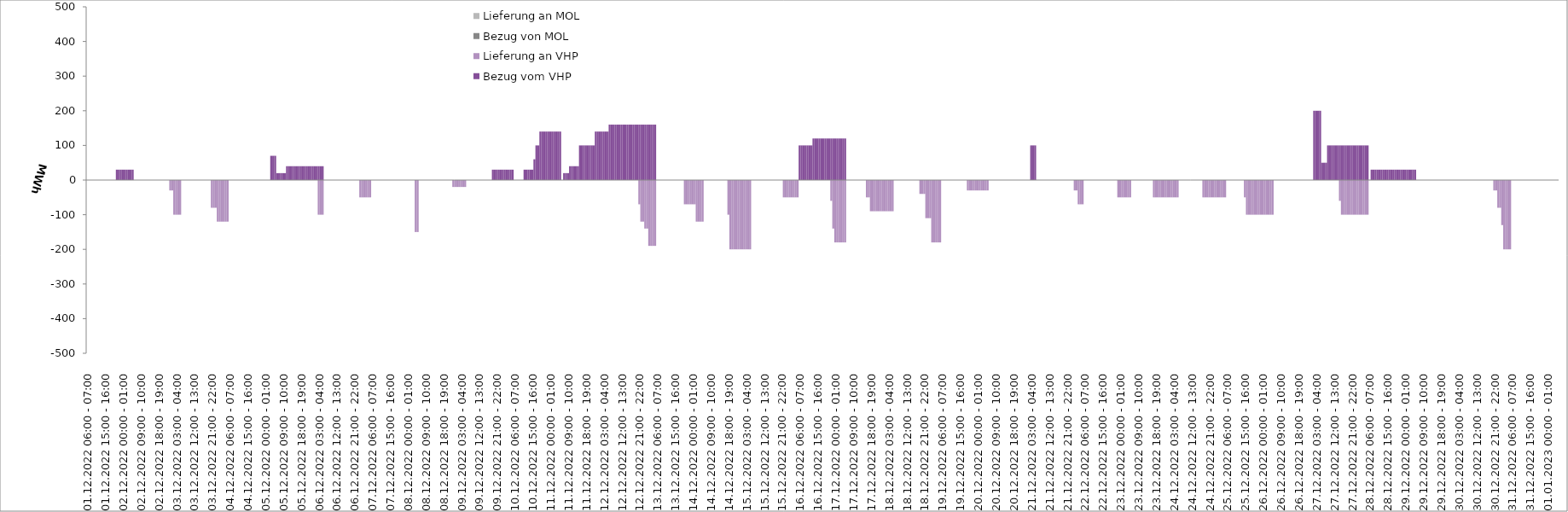
| Category | Bezug vom VHP | Lieferung an VHP | Bezug von MOL | Lieferung an MOL |
|---|---|---|---|---|
| 01.12.2022 06:00 - 07:00 | 0 | 0 | 0 | 0 |
| 01.12.2022 07:00 - 08:00 | 0 | 0 | 0 | 0 |
| 01.12.2022 08:00 - 09:00 | 0 | 0 | 0 | 0 |
| 01.12.2022 09:00 - 10:00 | 0 | 0 | 0 | 0 |
| 01.12.2022 10:00 - 11:00 | 0 | 0 | 0 | 0 |
| 01.12.2022 11:00 - 12:00 | 0 | 0 | 0 | 0 |
| 01.12.2022 12:00 - 13:00 | 0 | 0 | 0 | 0 |
| 01.12.2022 13:00 - 14:00 | 0 | 0 | 0 | 0 |
| 01.12.2022 14:00 - 15:00 | 0 | 0 | 0 | 0 |
| 01.12.2022 15:00 - 16:00 | 0 | 0 | 0 | 0 |
| 01.12.2022 16:00 - 17:00 | 0 | 0 | 0 | 0 |
| 01.12.2022 17:00 - 18:00 | 0 | 0 | 0 | 0 |
| 01.12.2022 18:00 - 19:00 | 0 | 0 | 0 | 0 |
| 01.12.2022 19:00 - 20:00 | 0 | 0 | 0 | 0 |
| 01.12.2022 20:00 - 21:00 | 0 | 0 | 0 | 0 |
| 01.12.2022 21:00 - 22:00 | 30 | 0 | 0 | 0 |
| 01.12.2022 22:00 - 23:00 | 30 | 0 | 0 | 0 |
| 01.12.2022 23:00 - 24:00 | 30 | 0 | 0 | 0 |
| 02.12.2022 00:00 - 01:00 | 30 | 0 | 0 | 0 |
| 02.12.2022 01:00 - 02:00 | 30 | 0 | 0 | 0 |
| 02.12.2022 02:00 - 03:00 | 30 | 0 | 0 | 0 |
| 02.12.2022 03:00 - 04:00 | 30 | 0 | 0 | 0 |
| 02.12.2022 04:00 - 05:00 | 30 | 0 | 0 | 0 |
| 02.12.2022 05:00 - 06:00 | 30 | 0 | 0 | 0 |
| 02.12.2022 06:00 - 07:00 | 0 | 0 | 0 | 0 |
| 02.12.2022 07:00 - 08:00 | 0 | 0 | 0 | 0 |
| 02.12.2022 08:00 - 09:00 | 0 | 0 | 0 | 0 |
| 02.12.2022 09:00 - 10:00 | 0 | 0 | 0 | 0 |
| 02.12.2022 10:00 - 11:00 | 0 | 0 | 0 | 0 |
| 02.12.2022 11:00 - 12:00 | 0 | 0 | 0 | 0 |
| 02.12.2022 12:00 - 13:00 | 0 | 0 | 0 | 0 |
| 02.12.2022 13:00 - 14:00 | 0 | 0 | 0 | 0 |
| 02.12.2022 14:00 - 15:00 | 0 | 0 | 0 | 0 |
| 02.12.2022 15:00 - 16:00 | 0 | 0 | 0 | 0 |
| 02.12.2022 16:00 - 17:00 | 0 | 0 | 0 | 0 |
| 02.12.2022 17:00 - 18:00 | 0 | 0 | 0 | 0 |
| 02.12.2022 18:00 - 19:00 | 0 | 0 | 0 | 0 |
| 02.12.2022 19:00 - 20:00 | 0 | 0 | 0 | 0 |
| 02.12.2022 20:00 - 21:00 | 0 | 0 | 0 | 0 |
| 02.12.2022 21:00 - 22:00 | 0 | 0 | 0 | 0 |
| 02.12.2022 22:00 - 23:00 | 0 | 0 | 0 | 0 |
| 02.12.2022 23:00 - 24:00 | 0 | 0 | 0 | 0 |
| 03.12.2022 00:00 - 01:00 | 0 | -30 | 0 | 0 |
| 03.12.2022 01:00 - 02:00 | 0 | -30 | 0 | 0 |
| 03.12.2022 02:00 - 03:00 | 0 | -100 | 0 | 0 |
| 03.12.2022 03:00 - 04:00 | 0 | -100 | 0 | 0 |
| 03.12.2022 04:00 - 05:00 | 0 | -100 | 0 | 0 |
| 03.12.2022 05:00 - 06:00 | 0 | -100 | 0 | 0 |
| 03.12.2022 06:00 - 07:00 | 0 | 0 | 0 | 0 |
| 03.12.2022 07:00 - 08:00 | 0 | 0 | 0 | 0 |
| 03.12.2022 08:00 - 09:00 | 0 | 0 | 0 | 0 |
| 03.12.2022 09:00 - 10:00 | 0 | 0 | 0 | 0 |
| 03.12.2022 10:00 - 11:00 | 0 | 0 | 0 | 0 |
| 03.12.2022 11:00 - 12:00 | 0 | 0 | 0 | 0 |
| 03.12.2022 12:00 - 13:00 | 0 | 0 | 0 | 0 |
| 03.12.2022 13:00 - 14:00 | 0 | 0 | 0 | 0 |
| 03.12.2022 14:00 - 15:00 | 0 | 0 | 0 | 0 |
| 03.12.2022 15:00 - 16:00 | 0 | 0 | 0 | 0 |
| 03.12.2022 16:00 - 17:00 | 0 | 0 | 0 | 0 |
| 03.12.2022 17:00 - 18:00 | 0 | 0 | 0 | 0 |
| 03.12.2022 18:00 - 19:00 | 0 | 0 | 0 | 0 |
| 03.12.2022 19:00 - 20:00 | 0 | 0 | 0 | 0 |
| 03.12.2022 20:00 - 21:00 | 0 | 0 | 0 | 0 |
| 03.12.2022 21:00 - 22:00 | 0 | -80 | 0 | 0 |
| 03.12.2022 22:00 - 23:00 | 0 | -80 | 0 | 0 |
| 03.12.2022 23:00 - 24:00 | 0 | -80 | 0 | 0 |
| 04.12.2022 00:00 - 01:00 | 0 | -120 | 0 | 0 |
| 04.12.2022 01:00 - 02:00 | 0 | -120 | 0 | 0 |
| 04.12.2022 02:00 - 03:00 | 0 | -120 | 0 | 0 |
| 04.12.2022 03:00 - 04:00 | 0 | -120 | 0 | 0 |
| 04.12.2022 04:00 - 05:00 | 0 | -120 | 0 | 0 |
| 04.12.2022 05:00 - 06:00 | 0 | -120 | 0 | 0 |
| 04.12.2022 06:00 - 07:00 | 0 | 0 | 0 | 0 |
| 04.12.2022 07:00 - 08:00 | 0 | 0 | 0 | 0 |
| 04.12.2022 08:00 - 09:00 | 0 | 0 | 0 | 0 |
| 04.12.2022 09:00 - 10:00 | 0 | 0 | 0 | 0 |
| 04.12.2022 10:00 - 11:00 | 0 | 0 | 0 | 0 |
| 04.12.2022 11:00 - 12:00 | 0 | 0 | 0 | 0 |
| 04.12.2022 12:00 - 13:00 | 0 | 0 | 0 | 0 |
| 04.12.2022 13:00 - 14:00 | 0 | 0 | 0 | 0 |
| 04.12.2022 14:00 - 15:00 | 0 | 0 | 0 | 0 |
| 04.12.2022 15:00 - 16:00 | 0 | 0 | 0 | 0 |
| 04.12.2022 16:00 - 17:00 | 0 | 0 | 0 | 0 |
| 04.12.2022 17:00 - 18:00 | 0 | 0 | 0 | 0 |
| 04.12.2022 18:00 - 19:00 | 0 | 0 | 0 | 0 |
| 04.12.2022 19:00 - 20:00 | 0 | 0 | 0 | 0 |
| 04.12.2022 20:00 - 21:00 | 0 | 0 | 0 | 0 |
| 04.12.2022 21:00 - 22:00 | 0 | 0 | 0 | 0 |
| 04.12.2022 22:00 - 23:00 | 0 | 0 | 0 | 0 |
| 04.12.2022 23:00 - 24:00 | 0 | 0 | 0 | 0 |
| 05.12.2022 00:00 - 01:00 | 0 | 0 | 0 | 0 |
| 05.12.2022 01:00 - 02:00 | 0 | 0 | 0 | 0 |
| 05.12.2022 02:00 - 03:00 | 0 | 0 | 0 | 0 |
| 05.12.2022 03:00 - 04:00 | 70 | 0 | 0 | 0 |
| 05.12.2022 04:00 - 05:00 | 70 | 0 | 0 | 0 |
| 05.12.2022 05:00 - 06:00 | 70 | 0 | 0 | 0 |
| 05.12.2022 06:00 - 07:00 | 20 | 0 | 0 | 0 |
| 05.12.2022 07:00 - 08:00 | 20 | 0 | 0 | 0 |
| 05.12.2022 08:00 - 09:00 | 20 | 0 | 0 | 0 |
| 05.12.2022 09:00 - 10:00 | 20 | 0 | 0 | 0 |
| 05.12.2022 10:00 - 11:00 | 20 | 0 | 0 | 0 |
| 05.12.2022 11:00 - 12:00 | 40 | 0 | 0 | 0 |
| 05.12.2022 12:00 - 13:00 | 40 | 0 | 0 | 0 |
| 05.12.2022 13:00 - 14:00 | 40 | 0 | 0 | 0 |
| 05.12.2022 14:00 - 15:00 | 40 | 0 | 0 | 0 |
| 05.12.2022 15:00 - 16:00 | 40 | 0 | 0 | 0 |
| 05.12.2022 16:00 - 17:00 | 40 | 0 | 0 | 0 |
| 05.12.2022 17:00 - 18:00 | 40 | 0 | 0 | 0 |
| 05.12.2022 18:00 - 19:00 | 40 | 0 | 0 | 0 |
| 05.12.2022 19:00 - 20:00 | 40 | 0 | 0 | 0 |
| 05.12.2022 20:00 - 21:00 | 40 | 0 | 0 | 0 |
| 05.12.2022 21:00 - 22:00 | 40 | 0 | 0 | 0 |
| 05.12.2022 22:00 - 23:00 | 40 | 0 | 0 | 0 |
| 05.12.2022 23:00 - 24:00 | 40 | 0 | 0 | 0 |
| 06.12.2022 00:00 - 01:00 | 40 | 0 | 0 | 0 |
| 06.12.2022 01:00 - 02:00 | 40 | 0 | 0 | 0 |
| 06.12.2022 02:00 - 03:00 | 40 | 0 | 0 | 0 |
| 06.12.2022 03:00 - 04:00 | 40 | -100 | 0 | 0 |
| 06.12.2022 04:00 - 05:00 | 40 | -100 | 0 | 0 |
| 06.12.2022 05:00 - 06:00 | 40 | -100 | 0 | 0 |
| 06.12.2022 06:00 - 07:00 | 0 | 0 | 0 | 0 |
| 06.12.2022 07:00 - 08:00 | 0 | 0 | 0 | 0 |
| 06.12.2022 08:00 - 09:00 | 0 | 0 | 0 | 0 |
| 06.12.2022 09:00 - 10:00 | 0 | 0 | 0 | 0 |
| 06.12.2022 10:00 - 11:00 | 0 | 0 | 0 | 0 |
| 06.12.2022 11:00 - 12:00 | 0 | 0 | 0 | 0 |
| 06.12.2022 12:00 - 13:00 | 0 | 0 | 0 | 0 |
| 06.12.2022 13:00 - 14:00 | 0 | 0 | 0 | 0 |
| 06.12.2022 14:00 - 15:00 | 0 | 0 | 0 | 0 |
| 06.12.2022 15:00 - 16:00 | 0 | 0 | 0 | 0 |
| 06.12.2022 16:00 - 17:00 | 0 | 0 | 0 | 0 |
| 06.12.2022 17:00 - 18:00 | 0 | 0 | 0 | 0 |
| 06.12.2022 18:00 - 19:00 | 0 | 0 | 0 | 0 |
| 06.12.2022 19:00 - 20:00 | 0 | 0 | 0 | 0 |
| 06.12.2022 20:00 - 21:00 | 0 | 0 | 0 | 0 |
| 06.12.2022 21:00 - 22:00 | 0 | 0 | 0 | 0 |
| 06.12.2022 22:00 - 23:00 | 0 | 0 | 0 | 0 |
| 06.12.2022 23:00 - 24:00 | 0 | 0 | 0 | 0 |
| 07.12.2022 00:00 - 01:00 | 0 | -50 | 0 | 0 |
| 07.12.2022 01:00 - 02:00 | 0 | -50 | 0 | 0 |
| 07.12.2022 02:00 - 03:00 | 0 | -50 | 0 | 0 |
| 07.12.2022 03:00 - 04:00 | 0 | -50 | 0 | 0 |
| 07.12.2022 04:00 - 05:00 | 0 | -50 | 0 | 0 |
| 07.12.2022 05:00 - 06:00 | 0 | -50 | 0 | 0 |
| 07.12.2022 06:00 - 07:00 | 0 | 0 | 0 | 0 |
| 07.12.2022 07:00 - 08:00 | 0 | 0 | 0 | 0 |
| 07.12.2022 08:00 - 09:00 | 0 | 0 | 0 | 0 |
| 07.12.2022 09:00 - 10:00 | 0 | 0 | 0 | 0 |
| 07.12.2022 10:00 - 11:00 | 0 | 0 | 0 | 0 |
| 07.12.2022 11:00 - 12:00 | 0 | 0 | 0 | 0 |
| 07.12.2022 12:00 - 13:00 | 0 | 0 | 0 | 0 |
| 07.12.2022 13:00 - 14:00 | 0 | 0 | 0 | 0 |
| 07.12.2022 14:00 - 15:00 | 0 | 0 | 0 | 0 |
| 07.12.2022 15:00 - 16:00 | 0 | 0 | 0 | 0 |
| 07.12.2022 16:00 - 17:00 | 0 | 0 | 0 | 0 |
| 07.12.2022 17:00 - 18:00 | 0 | 0 | 0 | 0 |
| 07.12.2022 18:00 - 19:00 | 0 | 0 | 0 | 0 |
| 07.12.2022 19:00 - 20:00 | 0 | 0 | 0 | 0 |
| 07.12.2022 20:00 - 21:00 | 0 | 0 | 0 | 0 |
| 07.12.2022 21:00 - 22:00 | 0 | 0 | 0 | 0 |
| 07.12.2022 22:00 - 23:00 | 0 | 0 | 0 | 0 |
| 07.12.2022 23:00 - 24:00 | 0 | 0 | 0 | 0 |
| 08.12.2022 00:00 - 01:00 | 0 | 0 | 0 | 0 |
| 08.12.2022 01:00 - 02:00 | 0 | 0 | 0 | 0 |
| 08.12.2022 02:00 - 03:00 | 0 | 0 | 0 | 0 |
| 08.12.2022 03:00 - 04:00 | 0 | 0 | 0 | 0 |
| 08.12.2022 04:00 - 05:00 | 0 | -150 | 0 | 0 |
| 08.12.2022 05:00 - 06:00 | 0 | -150 | 0 | 0 |
| 08.12.2022 06:00 - 07:00 | 0 | 0 | 0 | 0 |
| 08.12.2022 07:00 - 08:00 | 0 | 0 | 0 | 0 |
| 08.12.2022 08:00 - 09:00 | 0 | 0 | 0 | 0 |
| 08.12.2022 09:00 - 10:00 | 0 | 0 | 0 | 0 |
| 08.12.2022 10:00 - 11:00 | 0 | 0 | 0 | 0 |
| 08.12.2022 11:00 - 12:00 | 0 | 0 | 0 | 0 |
| 08.12.2022 12:00 - 13:00 | 0 | 0 | 0 | 0 |
| 08.12.2022 13:00 - 14:00 | 0 | 0 | 0 | 0 |
| 08.12.2022 14:00 - 15:00 | 0 | 0 | 0 | 0 |
| 08.12.2022 15:00 - 16:00 | 0 | 0 | 0 | 0 |
| 08.12.2022 16:00 - 17:00 | 0 | 0 | 0 | 0 |
| 08.12.2022 17:00 - 18:00 | 0 | 0 | 0 | 0 |
| 08.12.2022 18:00 - 19:00 | 0 | 0 | 0 | 0 |
| 08.12.2022 19:00 - 20:00 | 0 | 0 | 0 | 0 |
| 08.12.2022 20:00 - 21:00 | 0 | 0 | 0 | 0 |
| 08.12.2022 21:00 - 22:00 | 0 | 0 | 0 | 0 |
| 08.12.2022 22:00 - 23:00 | 0 | 0 | 0 | 0 |
| 08.12.2022 23:00 - 24:00 | 0 | -20 | 0 | 0 |
| 09.12.2022 00:00 - 01:00 | 0 | -20 | 0 | 0 |
| 09.12.2022 01:00 - 02:00 | 0 | -20 | 0 | 0 |
| 09.12.2022 02:00 - 03:00 | 0 | -20 | 0 | 0 |
| 09.12.2022 03:00 - 04:00 | 0 | -20 | 0 | 0 |
| 09.12.2022 04:00 - 05:00 | 0 | -20 | 0 | 0 |
| 09.12.2022 05:00 - 06:00 | 0 | -20 | 0 | 0 |
| 09.12.2022 06:00 - 07:00 | 0 | 0 | 0 | 0 |
| 09.12.2022 07:00 - 08:00 | 0 | 0 | 0 | 0 |
| 09.12.2022 08:00 - 09:00 | 0 | 0 | 0 | 0 |
| 09.12.2022 09:00 - 10:00 | 0 | 0 | 0 | 0 |
| 09.12.2022 10:00 - 11:00 | 0 | 0 | 0 | 0 |
| 09.12.2022 11:00 - 12:00 | 0 | 0 | 0 | 0 |
| 09.12.2022 12:00 - 13:00 | 0 | 0 | 0 | 0 |
| 09.12.2022 13:00 - 14:00 | 0 | 0 | 0 | 0 |
| 09.12.2022 14:00 - 15:00 | 0 | 0 | 0 | 0 |
| 09.12.2022 15:00 - 16:00 | 0 | 0 | 0 | 0 |
| 09.12.2022 16:00 - 17:00 | 0 | 0 | 0 | 0 |
| 09.12.2022 17:00 - 18:00 | 0 | 0 | 0 | 0 |
| 09.12.2022 18:00 - 19:00 | 0 | 0 | 0 | 0 |
| 09.12.2022 19:00 - 20:00 | 30 | 0 | 0 | 0 |
| 09.12.2022 20:00 - 21:00 | 30 | 0 | 0 | 0 |
| 09.12.2022 21:00 - 22:00 | 30 | 0 | 0 | 0 |
| 09.12.2022 22:00 - 23:00 | 30 | 0 | 0 | 0 |
| 09.12.2022 23:00 - 24:00 | 30 | 0 | 0 | 0 |
| 10.12.2022 00:00 - 01:00 | 30 | 0 | 0 | 0 |
| 10.12.2022 01:00 - 02:00 | 30 | 0 | 0 | 0 |
| 10.12.2022 02:00 - 03:00 | 30 | 0 | 0 | 0 |
| 10.12.2022 03:00 - 04:00 | 30 | 0 | 0 | 0 |
| 10.12.2022 04:00 - 05:00 | 30 | 0 | 0 | 0 |
| 10.12.2022 05:00 - 06:00 | 30 | 0 | 0 | 0 |
| 10.12.2022 06:00 - 07:00 | 0 | 0 | 0 | 0 |
| 10.12.2022 07:00 - 08:00 | 0 | 0 | 0 | 0 |
| 10.12.2022 08:00 - 09:00 | 0 | 0 | 0 | 0 |
| 10.12.2022 09:00 - 10:00 | 0 | 0 | 0 | 0 |
| 10.12.2022 10:00 - 11:00 | 0 | 0 | 0 | 0 |
| 10.12.2022 11:00 - 12:00 | 30 | 0 | 0 | 0 |
| 10.12.2022 12:00 - 13:00 | 30 | 0 | 0 | 0 |
| 10.12.2022 13:00 - 14:00 | 30 | 0 | 0 | 0 |
| 10.12.2022 14:00 - 15:00 | 30 | 0 | 0 | 0 |
| 10.12.2022 15:00 - 16:00 | 30 | 0 | 0 | 0 |
| 10.12.2022 16:00 - 17:00 | 60 | 0 | 0 | 0 |
| 10.12.2022 17:00 - 18:00 | 100 | 0 | 0 | 0 |
| 10.12.2022 18:00 - 19:00 | 100 | 0 | 0 | 0 |
| 10.12.2022 19:00 - 20:00 | 140 | 0 | 0 | 0 |
| 10.12.2022 20:00 - 21:00 | 140 | 0 | 0 | 0 |
| 10.12.2022 21:00 - 22:00 | 140 | 0 | 0 | 0 |
| 10.12.2022 22:00 - 23:00 | 140 | 0 | 0 | 0 |
| 10.12.2022 23:00 - 24:00 | 140 | 0 | 0 | 0 |
| 11.12.2022 00:00 - 01:00 | 140 | 0 | 0 | 0 |
| 11.12.2022 01:00 - 02:00 | 140 | 0 | 0 | 0 |
| 11.12.2022 02:00 - 03:00 | 140 | 0 | 0 | 0 |
| 11.12.2022 03:00 - 04:00 | 140 | 0 | 0 | 0 |
| 11.12.2022 04:00 - 05:00 | 140 | 0 | 0 | 0 |
| 11.12.2022 05:00 - 06:00 | 140 | 0 | 0 | 0 |
| 11.12.2022 06:00 - 07:00 | 0 | 0 | 0 | 0 |
| 11.12.2022 07:00 - 08:00 | 20 | 0 | 0 | 0 |
| 11.12.2022 08:00 - 09:00 | 20 | 0 | 0 | 0 |
| 11.12.2022 09:00 - 10:00 | 20 | 0 | 0 | 0 |
| 11.12.2022 10:00 - 11:00 | 40 | 0 | 0 | 0 |
| 11.12.2022 11:00 - 12:00 | 40 | 0 | 0 | 0 |
| 11.12.2022 12:00 - 13:00 | 40 | 0 | 0 | 0 |
| 11.12.2022 13:00 - 14:00 | 40 | 0 | 0 | 0 |
| 11.12.2022 14:00 - 15:00 | 40 | 0 | 0 | 0 |
| 11.12.2022 15:00 - 16:00 | 100 | 0 | 0 | 0 |
| 11.12.2022 16:00 - 17:00 | 100 | 0 | 0 | 0 |
| 11.12.2022 17:00 - 18:00 | 100 | 0 | 0 | 0 |
| 11.12.2022 18:00 - 19:00 | 100 | 0 | 0 | 0 |
| 11.12.2022 19:00 - 20:00 | 100 | 0 | 0 | 0 |
| 11.12.2022 20:00 - 21:00 | 100 | 0 | 0 | 0 |
| 11.12.2022 21:00 - 22:00 | 100 | 0 | 0 | 0 |
| 11.12.2022 22:00 - 23:00 | 100 | 0 | 0 | 0 |
| 11.12.2022 23:00 - 24:00 | 140 | 0 | 0 | 0 |
| 12.12.2022 00:00 - 01:00 | 140 | 0 | 0 | 0 |
| 12.12.2022 01:00 - 02:00 | 140 | 0 | 0 | 0 |
| 12.12.2022 02:00 - 03:00 | 140 | 0 | 0 | 0 |
| 12.12.2022 03:00 - 04:00 | 140 | 0 | 0 | 0 |
| 12.12.2022 04:00 - 05:00 | 140 | 0 | 0 | 0 |
| 12.12.2022 05:00 - 06:00 | 140 | 0 | 0 | 0 |
| 12.12.2022 06:00 - 07:00 | 160 | 0 | 0 | 0 |
| 12.12.2022 07:00 - 08:00 | 160 | 0 | 0 | 0 |
| 12.12.2022 08:00 - 09:00 | 160 | 0 | 0 | 0 |
| 12.12.2022 09:00 - 10:00 | 160 | 0 | 0 | 0 |
| 12.12.2022 10:00 - 11:00 | 160 | 0 | 0 | 0 |
| 12.12.2022 11:00 - 12:00 | 160 | 0 | 0 | 0 |
| 12.12.2022 12:00 - 13:00 | 160 | 0 | 0 | 0 |
| 12.12.2022 13:00 - 14:00 | 160 | 0 | 0 | 0 |
| 12.12.2022 14:00 - 15:00 | 160 | 0 | 0 | 0 |
| 12.12.2022 15:00 - 16:00 | 160 | 0 | 0 | 0 |
| 12.12.2022 16:00 - 17:00 | 160 | 0 | 0 | 0 |
| 12.12.2022 17:00 - 18:00 | 160 | 0 | 0 | 0 |
| 12.12.2022 18:00 - 19:00 | 160 | 0 | 0 | 0 |
| 12.12.2022 19:00 - 20:00 | 160 | 0 | 0 | 0 |
| 12.12.2022 20:00 - 21:00 | 160 | 0 | 0 | 0 |
| 12.12.2022 21:00 - 22:00 | 160 | -70 | 0 | 0 |
| 12.12.2022 22:00 - 23:00 | 160 | -120 | 0 | 0 |
| 12.12.2022 23:00 - 24:00 | 160 | -120 | 0 | 0 |
| 13.12.2022 00:00 - 01:00 | 160 | -140 | 0 | 0 |
| 13.12.2022 01:00 - 02:00 | 160 | -140 | 0 | 0 |
| 13.12.2022 02:00 - 03:00 | 160 | -190 | 0 | 0 |
| 13.12.2022 03:00 - 04:00 | 160 | -190 | 0 | 0 |
| 13.12.2022 04:00 - 05:00 | 160 | -190 | 0 | 0 |
| 13.12.2022 05:00 - 06:00 | 160 | -190 | 0 | 0 |
| 13.12.2022 06:00 - 07:00 | 0 | 0 | 0 | 0 |
| 13.12.2022 07:00 - 08:00 | 0 | 0 | 0 | 0 |
| 13.12.2022 08:00 - 09:00 | 0 | 0 | 0 | 0 |
| 13.12.2022 09:00 - 10:00 | 0 | 0 | 0 | 0 |
| 13.12.2022 10:00 - 11:00 | 0 | 0 | 0 | 0 |
| 13.12.2022 11:00 - 12:00 | 0 | 0 | 0 | 0 |
| 13.12.2022 12:00 - 13:00 | 0 | 0 | 0 | 0 |
| 13.12.2022 13:00 - 14:00 | 0 | 0 | 0 | 0 |
| 13.12.2022 14:00 - 15:00 | 0 | 0 | 0 | 0 |
| 13.12.2022 15:00 - 16:00 | 0 | 0 | 0 | 0 |
| 13.12.2022 16:00 - 17:00 | 0 | 0 | 0 | 0 |
| 13.12.2022 17:00 - 18:00 | 0 | 0 | 0 | 0 |
| 13.12.2022 18:00 - 19:00 | 0 | 0 | 0 | 0 |
| 13.12.2022 19:00 - 20:00 | 0 | 0 | 0 | 0 |
| 13.12.2022 20:00 - 21:00 | 0 | -70 | 0 | 0 |
| 13.12.2022 21:00 - 22:00 | 0 | -70 | 0 | 0 |
| 13.12.2022 22:00 - 23:00 | 0 | -70 | 0 | 0 |
| 13.12.2022 23:00 - 24:00 | 0 | -70 | 0 | 0 |
| 14.12.2022 00:00 - 01:00 | 0 | -70 | 0 | 0 |
| 14.12.2022 01:00 - 02:00 | 0 | -70 | 0 | 0 |
| 14.12.2022 02:00 - 03:00 | 0 | -120 | 0 | 0 |
| 14.12.2022 03:00 - 04:00 | 0 | -120 | 0 | 0 |
| 14.12.2022 04:00 - 05:00 | 0 | -120 | 0 | 0 |
| 14.12.2022 05:00 - 06:00 | 0 | -120 | 0 | 0 |
| 14.12.2022 06:00 - 07:00 | 0 | 0 | 0 | 0 |
| 14.12.2022 07:00 - 08:00 | 0 | 0 | 0 | 0 |
| 14.12.2022 08:00 - 09:00 | 0 | 0 | 0 | 0 |
| 14.12.2022 09:00 - 10:00 | 0 | 0 | 0 | 0 |
| 14.12.2022 10:00 - 11:00 | 0 | 0 | 0 | 0 |
| 14.12.2022 11:00 - 12:00 | 0 | 0 | 0 | 0 |
| 14.12.2022 12:00 - 13:00 | 0 | 0 | 0 | 0 |
| 14.12.2022 13:00 - 14:00 | 0 | 0 | 0 | 0 |
| 14.12.2022 14:00 - 15:00 | 0 | 0 | 0 | 0 |
| 14.12.2022 15:00 - 16:00 | 0 | 0 | 0 | 0 |
| 14.12.2022 16:00 - 17:00 | 0 | 0 | 0 | 0 |
| 14.12.2022 17:00 - 18:00 | 0 | 0 | 0 | 0 |
| 14.12.2022 18:00 - 19:00 | 0 | -100 | 0 | 0 |
| 14.12.2022 19:00 - 20:00 | 0 | -200 | 0 | 0 |
| 14.12.2022 20:00 - 21:00 | 0 | -200 | 0 | 0 |
| 14.12.2022 21:00 - 22:00 | 0 | -200 | 0 | 0 |
| 14.12.2022 22:00 - 23:00 | 0 | -200 | 0 | 0 |
| 14.12.2022 23:00 - 24:00 | 0 | -200 | 0 | 0 |
| 15.12.2022 00:00 - 01:00 | 0 | -200 | 0 | 0 |
| 15.12.2022 01:00 - 02:00 | 0 | -200 | 0 | 0 |
| 15.12.2022 02:00 - 03:00 | 0 | -200 | 0 | 0 |
| 15.12.2022 03:00 - 04:00 | 0 | -200 | 0 | 0 |
| 15.12.2022 04:00 - 05:00 | 0 | -200 | 0 | 0 |
| 15.12.2022 05:00 - 06:00 | 0 | -200 | 0 | 0 |
| 15.12.2022 06:00 - 07:00 | 0 | 0 | 0 | 0 |
| 15.12.2022 07:00 - 08:00 | 0 | 0 | 0 | 0 |
| 15.12.2022 08:00 - 09:00 | 0 | 0 | 0 | 0 |
| 15.12.2022 09:00 - 10:00 | 0 | 0 | 0 | 0 |
| 15.12.2022 10:00 - 11:00 | 0 | 0 | 0 | 0 |
| 15.12.2022 11:00 - 12:00 | 0 | 0 | 0 | 0 |
| 15.12.2022 12:00 - 13:00 | 0 | 0 | 0 | 0 |
| 15.12.2022 13:00 - 14:00 | 0 | 0 | 0 | 0 |
| 15.12.2022 14:00 - 15:00 | 0 | 0 | 0 | 0 |
| 15.12.2022 15:00 - 16:00 | 0 | 0 | 0 | 0 |
| 15.12.2022 16:00 - 17:00 | 0 | 0 | 0 | 0 |
| 15.12.2022 17:00 - 18:00 | 0 | 0 | 0 | 0 |
| 15.12.2022 18:00 - 19:00 | 0 | 0 | 0 | 0 |
| 15.12.2022 19:00 - 20:00 | 0 | 0 | 0 | 0 |
| 15.12.2022 20:00 - 21:00 | 0 | 0 | 0 | 0 |
| 15.12.2022 21:00 - 22:00 | 0 | 0 | 0 | 0 |
| 15.12.2022 22:00 - 23:00 | 0 | -50 | 0 | 0 |
| 15.12.2022 23:00 - 24:00 | 0 | -50 | 0 | 0 |
| 16.12.2022 00:00 - 01:00 | 0 | -50 | 0 | 0 |
| 16.12.2022 01:00 - 02:00 | 0 | -50 | 0 | 0 |
| 16.12.2022 02:00 - 03:00 | 0 | -50 | 0 | 0 |
| 16.12.2022 03:00 - 04:00 | 0 | -50 | 0 | 0 |
| 16.12.2022 04:00 - 05:00 | 0 | -50 | 0 | 0 |
| 16.12.2022 05:00 - 06:00 | 0 | -50 | 0 | 0 |
| 16.12.2022 06:00 - 07:00 | 100 | 0 | 0 | 0 |
| 16.12.2022 07:00 - 08:00 | 100 | 0 | 0 | 0 |
| 16.12.2022 08:00 - 09:00 | 100 | 0 | 0 | 0 |
| 16.12.2022 09:00 - 10:00 | 100 | 0 | 0 | 0 |
| 16.12.2022 10:00 - 11:00 | 100 | 0 | 0 | 0 |
| 16.12.2022 11:00 - 12:00 | 100 | 0 | 0 | 0 |
| 16.12.2022 12:00 - 13:00 | 100 | 0 | 0 | 0 |
| 16.12.2022 13:00 - 14:00 | 120 | 0 | 0 | 0 |
| 16.12.2022 14:00 - 15:00 | 120 | 0 | 0 | 0 |
| 16.12.2022 15:00 - 16:00 | 120 | 0 | 0 | 0 |
| 16.12.2022 16:00 - 17:00 | 120 | 0 | 0 | 0 |
| 16.12.2022 17:00 - 18:00 | 120 | 0 | 0 | 0 |
| 16.12.2022 18:00 - 19:00 | 120 | 0 | 0 | 0 |
| 16.12.2022 19:00 - 20:00 | 120 | 0 | 0 | 0 |
| 16.12.2022 20:00 - 21:00 | 120 | 0 | 0 | 0 |
| 16.12.2022 21:00 - 22:00 | 120 | 0 | 0 | 0 |
| 16.12.2022 22:00 - 23:00 | 120 | -60 | 0 | 0 |
| 16.12.2022 23:00 - 24:00 | 120 | -140 | 0 | 0 |
| 17.12.2022 00:00 - 01:00 | 120 | -180 | 0 | 0 |
| 17.12.2022 01:00 - 02:00 | 120 | -180 | 0 | 0 |
| 17.12.2022 02:00 - 03:00 | 120 | -180 | 0 | 0 |
| 17.12.2022 03:00 - 04:00 | 120 | -180 | 0 | 0 |
| 17.12.2022 04:00 - 05:00 | 120 | -180 | 0 | 0 |
| 17.12.2022 05:00 - 06:00 | 120 | -180 | 0 | 0 |
| 17.12.2022 06:00 - 07:00 | 0 | 0 | 0 | 0 |
| 17.12.2022 07:00 - 08:00 | 0 | 0 | 0 | 0 |
| 17.12.2022 08:00 - 09:00 | 0 | 0 | 0 | 0 |
| 17.12.2022 09:00 - 10:00 | 0 | 0 | 0 | 0 |
| 17.12.2022 10:00 - 11:00 | 0 | 0 | 0 | 0 |
| 17.12.2022 11:00 - 12:00 | 0 | 0 | 0 | 0 |
| 17.12.2022 12:00 - 13:00 | 0 | 0 | 0 | 0 |
| 17.12.2022 13:00 - 14:00 | 0 | 0 | 0 | 0 |
| 17.12.2022 14:00 - 15:00 | 0 | 0 | 0 | 0 |
| 17.12.2022 15:00 - 16:00 | 0 | 0 | 0 | 0 |
| 17.12.2022 16:00 - 17:00 | 0 | -50 | 0 | 0 |
| 17.12.2022 17:00 - 18:00 | 0 | -50 | 0 | 0 |
| 17.12.2022 18:00 - 19:00 | 0 | -90 | 0 | 0 |
| 17.12.2022 19:00 - 20:00 | 0 | -90 | 0 | 0 |
| 17.12.2022 20:00 - 21:00 | 0 | -90 | 0 | 0 |
| 17.12.2022 21:00 - 22:00 | 0 | -90 | 0 | 0 |
| 17.12.2022 22:00 - 23:00 | 0 | -90 | 0 | 0 |
| 17.12.2022 23:00 - 24:00 | 0 | -90 | 0 | 0 |
| 18.12.2022 00:00 - 01:00 | 0 | -90 | 0 | 0 |
| 18.12.2022 01:00 - 02:00 | 0 | -90 | 0 | 0 |
| 18.12.2022 02:00 - 03:00 | 0 | -90 | 0 | 0 |
| 18.12.2022 03:00 - 04:00 | 0 | -90 | 0 | 0 |
| 18.12.2022 04:00 - 05:00 | 0 | -90 | 0 | 0 |
| 18.12.2022 05:00 - 06:00 | 0 | -90 | 0 | 0 |
| 18.12.2022 06:00 - 07:00 | 0 | 0 | 0 | 0 |
| 18.12.2022 07:00 - 08:00 | 0 | 0 | 0 | 0 |
| 18.12.2022 08:00 - 09:00 | 0 | 0 | 0 | 0 |
| 18.12.2022 09:00 - 10:00 | 0 | 0 | 0 | 0 |
| 18.12.2022 10:00 - 11:00 | 0 | 0 | 0 | 0 |
| 18.12.2022 11:00 - 12:00 | 0 | 0 | 0 | 0 |
| 18.12.2022 12:00 - 13:00 | 0 | 0 | 0 | 0 |
| 18.12.2022 13:00 - 14:00 | 0 | 0 | 0 | 0 |
| 18.12.2022 14:00 - 15:00 | 0 | 0 | 0 | 0 |
| 18.12.2022 15:00 - 16:00 | 0 | 0 | 0 | 0 |
| 18.12.2022 16:00 - 17:00 | 0 | 0 | 0 | 0 |
| 18.12.2022 17:00 - 18:00 | 0 | 0 | 0 | 0 |
| 18.12.2022 18:00 - 19:00 | 0 | 0 | 0 | 0 |
| 18.12.2022 19:00 - 20:00 | 0 | -40 | 0 | 0 |
| 18.12.2022 20:00 - 21:00 | 0 | -40 | 0 | 0 |
| 18.12.2022 21:00 - 22:00 | 0 | -40 | 0 | 0 |
| 18.12.2022 22:00 - 23:00 | 0 | -110 | 0 | 0 |
| 18.12.2022 23:00 - 24:00 | 0 | -110 | 0 | 0 |
| 19.12.2022 00:00 - 01:00 | 0 | -110 | 0 | 0 |
| 19.12.2022 01:00 - 02:00 | 0 | -180 | 0 | 0 |
| 19.12.2022 02:00 - 03:00 | 0 | -180 | 0 | 0 |
| 19.12.2022 03:00 - 04:00 | 0 | -180 | 0 | 0 |
| 19.12.2022 04:00 - 05:00 | 0 | -180 | 0 | 0 |
| 19.12.2022 05:00 - 06:00 | 0 | -180 | 0 | 0 |
| 19.12.2022 06:00 - 07:00 | 0 | 0 | 0 | 0 |
| 19.12.2022 07:00 - 08:00 | 0 | 0 | 0 | 0 |
| 19.12.2022 08:00 - 09:00 | 0 | 0 | 0 | 0 |
| 19.12.2022 09:00 - 10:00 | 0 | 0 | 0 | 0 |
| 19.12.2022 10:00 - 11:00 | 0 | 0 | 0 | 0 |
| 19.12.2022 11:00 - 12:00 | 0 | 0 | 0 | 0 |
| 19.12.2022 12:00 - 13:00 | 0 | 0 | 0 | 0 |
| 19.12.2022 13:00 - 14:00 | 0 | 0 | 0 | 0 |
| 19.12.2022 14:00 - 15:00 | 0 | 0 | 0 | 0 |
| 19.12.2022 15:00 - 16:00 | 0 | 0 | 0 | 0 |
| 19.12.2022 16:00 - 17:00 | 0 | 0 | 0 | 0 |
| 19.12.2022 17:00 - 18:00 | 0 | 0 | 0 | 0 |
| 19.12.2022 18:00 - 19:00 | 0 | 0 | 0 | 0 |
| 19.12.2022 19:00 - 20:00 | 0 | -30 | 0 | 0 |
| 19.12.2022 20:00 - 21:00 | 0 | -30 | 0 | 0 |
| 19.12.2022 21:00 - 22:00 | 0 | -30 | 0 | 0 |
| 19.12.2022 22:00 - 23:00 | 0 | -30 | 0 | 0 |
| 19.12.2022 23:00 - 24:00 | 0 | -30 | 0 | 0 |
| 20.12.2022 00:00 - 01:00 | 0 | -30 | 0 | 0 |
| 20.12.2022 01:00 - 02:00 | 0 | -30 | 0 | 0 |
| 20.12.2022 02:00 - 03:00 | 0 | -30 | 0 | 0 |
| 20.12.2022 03:00 - 04:00 | 0 | -30 | 0 | 0 |
| 20.12.2022 04:00 - 05:00 | 0 | -30 | 0 | 0 |
| 20.12.2022 05:00 - 06:00 | 0 | -30 | 0 | 0 |
| 20.12.2022 06:00 - 07:00 | 0 | 0 | 0 | 0 |
| 20.12.2022 07:00 - 08:00 | 0 | 0 | 0 | 0 |
| 20.12.2022 08:00 - 09:00 | 0 | 0 | 0 | 0 |
| 20.12.2022 09:00 - 10:00 | 0 | 0 | 0 | 0 |
| 20.12.2022 10:00 - 11:00 | 0 | 0 | 0 | 0 |
| 20.12.2022 11:00 - 12:00 | 0 | 0 | 0 | 0 |
| 20.12.2022 12:00 - 13:00 | 0 | 0 | 0 | 0 |
| 20.12.2022 13:00 - 14:00 | 0 | 0 | 0 | 0 |
| 20.12.2022 14:00 - 15:00 | 0 | 0 | 0 | 0 |
| 20.12.2022 15:00 - 16:00 | 0 | 0 | 0 | 0 |
| 20.12.2022 16:00 - 17:00 | 0 | 0 | 0 | 0 |
| 20.12.2022 17:00 - 18:00 | 0 | 0 | 0 | 0 |
| 20.12.2022 18:00 - 19:00 | 0 | 0 | 0 | 0 |
| 20.12.2022 19:00 - 20:00 | 0 | 0 | 0 | 0 |
| 20.12.2022 20:00 - 21:00 | 0 | 0 | 0 | 0 |
| 20.12.2022 21:00 - 22:00 | 0 | 0 | 0 | 0 |
| 20.12.2022 22:00 - 23:00 | 0 | 0 | 0 | 0 |
| 20.12.2022 23:00 - 24:00 | 0 | 0 | 0 | 0 |
| 21.12.2022 00:00 - 01:00 | 0 | 0 | 0 | 0 |
| 21.12.2022 01:00 - 02:00 | 0 | 0 | 0 | 0 |
| 21.12.2022 02:00 - 03:00 | 0 | 0 | 0 | 0 |
| 21.12.2022 03:00 - 04:00 | 100 | 0 | 0 | 0 |
| 21.12.2022 04:00 - 05:00 | 100 | 0 | 0 | 0 |
| 21.12.2022 05:00 - 06:00 | 100 | 0 | 0 | 0 |
| 21.12.2022 06:00 - 07:00 | 0 | 0 | 0 | 0 |
| 21.12.2022 07:00 - 08:00 | 0 | 0 | 0 | 0 |
| 21.12.2022 08:00 - 09:00 | 0 | 0 | 0 | 0 |
| 21.12.2022 09:00 - 10:00 | 0 | 0 | 0 | 0 |
| 21.12.2022 10:00 - 11:00 | 0 | 0 | 0 | 0 |
| 21.12.2022 11:00 - 12:00 | 0 | 0 | 0 | 0 |
| 21.12.2022 12:00 - 13:00 | 0 | 0 | 0 | 0 |
| 21.12.2022 13:00 - 14:00 | 0 | 0 | 0 | 0 |
| 21.12.2022 14:00 - 15:00 | 0 | 0 | 0 | 0 |
| 21.12.2022 15:00 - 16:00 | 0 | 0 | 0 | 0 |
| 21.12.2022 16:00 - 17:00 | 0 | 0 | 0 | 0 |
| 21.12.2022 17:00 - 18:00 | 0 | 0 | 0 | 0 |
| 21.12.2022 18:00 - 19:00 | 0 | 0 | 0 | 0 |
| 21.12.2022 19:00 - 20:00 | 0 | 0 | 0 | 0 |
| 21.12.2022 20:00 - 21:00 | 0 | 0 | 0 | 0 |
| 21.12.2022 21:00 - 22:00 | 0 | 0 | 0 | 0 |
| 21.12.2022 22:00 - 23:00 | 0 | 0 | 0 | 0 |
| 21.12.2022 23:00 - 24:00 | 0 | 0 | 0 | 0 |
| 22.12.2022 00:00 - 01:00 | 0 | 0 | 0 | 0 |
| 22.12.2022 01:00 - 02:00 | 0 | -30 | 0 | 0 |
| 22.12.2022 02:00 - 03:00 | 0 | -30 | 0 | 0 |
| 22.12.2022 03:00 - 04:00 | 0 | -70 | 0 | 0 |
| 22.12.2022 04:00 - 05:00 | 0 | -70 | 0 | 0 |
| 22.12.2022 05:00 - 06:00 | 0 | -70 | 0 | 0 |
| 22.12.2022 06:00 - 07:00 | 0 | 0 | 0 | 0 |
| 22.12.2022 07:00 - 08:00 | 0 | 0 | 0 | 0 |
| 22.12.2022 08:00 - 09:00 | 0 | 0 | 0 | 0 |
| 22.12.2022 09:00 - 10:00 | 0 | 0 | 0 | 0 |
| 22.12.2022 10:00 - 11:00 | 0 | 0 | 0 | 0 |
| 22.12.2022 11:00 - 12:00 | 0 | 0 | 0 | 0 |
| 22.12.2022 12:00 - 13:00 | 0 | 0 | 0 | 0 |
| 22.12.2022 13:00 - 14:00 | 0 | 0 | 0 | 0 |
| 22.12.2022 14:00 - 15:00 | 0 | 0 | 0 | 0 |
| 22.12.2022 15:00 - 16:00 | 0 | 0 | 0 | 0 |
| 22.12.2022 16:00 - 17:00 | 0 | 0 | 0 | 0 |
| 22.12.2022 17:00 - 18:00 | 0 | 0 | 0 | 0 |
| 22.12.2022 18:00 - 19:00 | 0 | 0 | 0 | 0 |
| 22.12.2022 19:00 - 20:00 | 0 | 0 | 0 | 0 |
| 22.12.2022 20:00 - 21:00 | 0 | 0 | 0 | 0 |
| 22.12.2022 21:00 - 22:00 | 0 | 0 | 0 | 0 |
| 22.12.2022 22:00 - 23:00 | 0 | 0 | 0 | 0 |
| 22.12.2022 23:00 - 24:00 | 0 | -50 | 0 | 0 |
| 23.12.2022 00:00 - 01:00 | 0 | -50 | 0 | 0 |
| 23.12.2022 01:00 - 02:00 | 0 | -50 | 0 | 0 |
| 23.12.2022 02:00 - 03:00 | 0 | -50 | 0 | 0 |
| 23.12.2022 03:00 - 04:00 | 0 | -50 | 0 | 0 |
| 23.12.2022 04:00 - 05:00 | 0 | -50 | 0 | 0 |
| 23.12.2022 05:00 - 06:00 | 0 | -50 | 0 | 0 |
| 23.12.2022 06:00 - 07:00 | 0 | 0 | 0 | 0 |
| 23.12.2022 07:00 - 08:00 | 0 | 0 | 0 | 0 |
| 23.12.2022 08:00 - 09:00 | 0 | 0 | 0 | 0 |
| 23.12.2022 09:00 - 10:00 | 0 | 0 | 0 | 0 |
| 23.12.2022 10:00 - 11:00 | 0 | 0 | 0 | 0 |
| 23.12.2022 11:00 - 12:00 | 0 | 0 | 0 | 0 |
| 23.12.2022 12:00 - 13:00 | 0 | 0 | 0 | 0 |
| 23.12.2022 13:00 - 14:00 | 0 | 0 | 0 | 0 |
| 23.12.2022 14:00 - 15:00 | 0 | 0 | 0 | 0 |
| 23.12.2022 15:00 - 16:00 | 0 | 0 | 0 | 0 |
| 23.12.2022 16:00 - 17:00 | 0 | 0 | 0 | 0 |
| 23.12.2022 17:00 - 18:00 | 0 | -50 | 0 | 0 |
| 23.12.2022 18:00 - 19:00 | 0 | -50 | 0 | 0 |
| 23.12.2022 19:00 - 20:00 | 0 | -50 | 0 | 0 |
| 23.12.2022 20:00 - 21:00 | 0 | -50 | 0 | 0 |
| 23.12.2022 21:00 - 22:00 | 0 | -50 | 0 | 0 |
| 23.12.2022 22:00 - 23:00 | 0 | -50 | 0 | 0 |
| 23.12.2022 23:00 - 24:00 | 0 | -50 | 0 | 0 |
| 24.12.2022 00:00 - 01:00 | 0 | -50 | 0 | 0 |
| 24.12.2022 01:00 - 02:00 | 0 | -50 | 0 | 0 |
| 24.12.2022 02:00 - 03:00 | 0 | -50 | 0 | 0 |
| 24.12.2022 03:00 - 04:00 | 0 | -50 | 0 | 0 |
| 24.12.2022 04:00 - 05:00 | 0 | -50 | 0 | 0 |
| 24.12.2022 05:00 - 06:00 | 0 | -50 | 0 | 0 |
| 24.12.2022 06:00 - 07:00 | 0 | 0 | 0 | 0 |
| 24.12.2022 07:00 - 08:00 | 0 | 0 | 0 | 0 |
| 24.12.2022 08:00 - 09:00 | 0 | 0 | 0 | 0 |
| 24.12.2022 09:00 - 10:00 | 0 | 0 | 0 | 0 |
| 24.12.2022 10:00 - 11:00 | 0 | 0 | 0 | 0 |
| 24.12.2022 11:00 - 12:00 | 0 | 0 | 0 | 0 |
| 24.12.2022 12:00 - 13:00 | 0 | 0 | 0 | 0 |
| 24.12.2022 13:00 - 14:00 | 0 | 0 | 0 | 0 |
| 24.12.2022 14:00 - 15:00 | 0 | 0 | 0 | 0 |
| 24.12.2022 15:00 - 16:00 | 0 | 0 | 0 | 0 |
| 24.12.2022 16:00 - 17:00 | 0 | 0 | 0 | 0 |
| 24.12.2022 17:00 - 18:00 | 0 | 0 | 0 | 0 |
| 24.12.2022 18:00 - 19:00 | 0 | -50 | 0 | 0 |
| 24.12.2022 19:00 - 20:00 | 0 | -50 | 0 | 0 |
| 24.12.2022 20:00 - 21:00 | 0 | -50 | 0 | 0 |
| 24.12.2022 21:00 - 22:00 | 0 | -50 | 0 | 0 |
| 24.12.2022 22:00 - 23:00 | 0 | -50 | 0 | 0 |
| 24.12.2022 23:00 - 24:00 | 0 | -50 | 0 | 0 |
| 25.12.2022 00:00 - 01:00 | 0 | -50 | 0 | 0 |
| 25.12.2022 01:00 - 02:00 | 0 | -50 | 0 | 0 |
| 25.12.2022 02:00 - 03:00 | 0 | -50 | 0 | 0 |
| 25.12.2022 03:00 - 04:00 | 0 | -50 | 0 | 0 |
| 25.12.2022 04:00 - 05:00 | 0 | -50 | 0 | 0 |
| 25.12.2022 05:00 - 06:00 | 0 | -50 | 0 | 0 |
| 25.12.2022 06:00 - 07:00 | 0 | 0 | 0 | 0 |
| 25.12.2022 07:00 - 08:00 | 0 | 0 | 0 | 0 |
| 25.12.2022 08:00 - 09:00 | 0 | 0 | 0 | 0 |
| 25.12.2022 09:00 - 10:00 | 0 | 0 | 0 | 0 |
| 25.12.2022 10:00 - 11:00 | 0 | 0 | 0 | 0 |
| 25.12.2022 11:00 - 12:00 | 0 | 0 | 0 | 0 |
| 25.12.2022 12:00 - 13:00 | 0 | 0 | 0 | 0 |
| 25.12.2022 13:00 - 14:00 | 0 | 0 | 0 | 0 |
| 25.12.2022 14:00 - 15:00 | 0 | 0 | 0 | 0 |
| 25.12.2022 15:00 - 16:00 | 0 | -50 | 0 | 0 |
| 25.12.2022 16:00 - 17:00 | 0 | -100 | 0 | 0 |
| 25.12.2022 17:00 - 18:00 | 0 | -100 | 0 | 0 |
| 25.12.2022 18:00 - 19:00 | 0 | -100 | 0 | 0 |
| 25.12.2022 19:00 - 20:00 | 0 | -100 | 0 | 0 |
| 25.12.2022 20:00 - 21:00 | 0 | -100 | 0 | 0 |
| 25.12.2022 21:00 - 22:00 | 0 | -100 | 0 | 0 |
| 25.12.2022 22:00 - 23:00 | 0 | -100 | 0 | 0 |
| 25.12.2022 23:00 - 24:00 | 0 | -100 | 0 | 0 |
| 26.12.2022 00:00 - 01:00 | 0 | -100 | 0 | 0 |
| 26.12.2022 01:00 - 02:00 | 0 | -100 | 0 | 0 |
| 26.12.2022 02:00 - 03:00 | 0 | -100 | 0 | 0 |
| 26.12.2022 03:00 - 04:00 | 0 | -100 | 0 | 0 |
| 26.12.2022 04:00 - 05:00 | 0 | -100 | 0 | 0 |
| 26.12.2022 05:00 - 06:00 | 0 | -100 | 0 | 0 |
| 26.12.2022 06:00 - 07:00 | 0 | 0 | 0 | 0 |
| 26.12.2022 07:00 - 08:00 | 0 | 0 | 0 | 0 |
| 26.12.2022 08:00 - 09:00 | 0 | 0 | 0 | 0 |
| 26.12.2022 09:00 - 10:00 | 0 | 0 | 0 | 0 |
| 26.12.2022 10:00 - 11:00 | 0 | 0 | 0 | 0 |
| 26.12.2022 11:00 - 12:00 | 0 | 0 | 0 | 0 |
| 26.12.2022 12:00 - 13:00 | 0 | 0 | 0 | 0 |
| 26.12.2022 13:00 - 14:00 | 0 | 0 | 0 | 0 |
| 26.12.2022 14:00 - 15:00 | 0 | 0 | 0 | 0 |
| 26.12.2022 15:00 - 16:00 | 0 | 0 | 0 | 0 |
| 26.12.2022 16:00 - 17:00 | 0 | 0 | 0 | 0 |
| 26.12.2022 17:00 - 18:00 | 0 | 0 | 0 | 0 |
| 26.12.2022 18:00 - 19:00 | 0 | 0 | 0 | 0 |
| 26.12.2022 19:00 - 20:00 | 0 | 0 | 0 | 0 |
| 26.12.2022 20:00 - 21:00 | 0 | 0 | 0 | 0 |
| 26.12.2022 21:00 - 22:00 | 0 | 0 | 0 | 0 |
| 26.12.2022 22:00 - 23:00 | 0 | 0 | 0 | 0 |
| 26.12.2022 23:00 - 24:00 | 0 | 0 | 0 | 0 |
| 27.12.2022 00:00 - 01:00 | 0 | 0 | 0 | 0 |
| 27.12.2022 01:00 - 02:00 | 0 | 0 | 0 | 0 |
| 27.12.2022 02:00 - 03:00 | 200 | 0 | 0 | 0 |
| 27.12.2022 03:00 - 04:00 | 200 | 0 | 0 | 0 |
| 27.12.2022 04:00 - 05:00 | 200 | 0 | 0 | 0 |
| 27.12.2022 05:00 - 06:00 | 200 | 0 | 0 | 0 |
| 27.12.2022 06:00 - 07:00 | 50 | 0 | 0 | 0 |
| 27.12.2022 07:00 - 08:00 | 50 | 0 | 0 | 0 |
| 27.12.2022 08:00 - 09:00 | 50 | 0 | 0 | 0 |
| 27.12.2022 09:00 - 10:00 | 100 | 0 | 0 | 0 |
| 27.12.2022 10:00 - 11:00 | 100 | 0 | 0 | 0 |
| 27.12.2022 11:00 - 12:00 | 100 | 0 | 0 | 0 |
| 27.12.2022 12:00 - 13:00 | 100 | 0 | 0 | 0 |
| 27.12.2022 13:00 - 14:00 | 100 | 0 | 0 | 0 |
| 27.12.2022 14:00 - 15:00 | 100 | 0 | 0 | 0 |
| 27.12.2022 15:00 - 16:00 | 100 | -60 | 0 | 0 |
| 27.12.2022 16:00 - 17:00 | 100 | -100 | 0 | 0 |
| 27.12.2022 17:00 - 18:00 | 100 | -100 | 0 | 0 |
| 27.12.2022 18:00 - 19:00 | 100 | -100 | 0 | 0 |
| 27.12.2022 19:00 - 20:00 | 100 | -100 | 0 | 0 |
| 27.12.2022 20:00 - 21:00 | 100 | -100 | 0 | 0 |
| 27.12.2022 21:00 - 22:00 | 100 | -100 | 0 | 0 |
| 27.12.2022 22:00 - 23:00 | 100 | -100 | 0 | 0 |
| 27.12.2022 23:00 - 24:00 | 100 | -100 | 0 | 0 |
| 28.12.2022 00:00 - 01:00 | 100 | -100 | 0 | 0 |
| 28.12.2022 01:00 - 02:00 | 100 | -100 | 0 | 0 |
| 28.12.2022 02:00 - 03:00 | 100 | -100 | 0 | 0 |
| 28.12.2022 03:00 - 04:00 | 100 | -100 | 0 | 0 |
| 28.12.2022 04:00 - 05:00 | 100 | -100 | 0 | 0 |
| 28.12.2022 05:00 - 06:00 | 100 | -100 | 0 | 0 |
| 28.12.2022 06:00 - 07:00 | 0 | 0 | 0 | 0 |
| 28.12.2022 07:00 - 08:00 | 30 | 0 | 0 | 0 |
| 28.12.2022 08:00 - 09:00 | 30 | 0 | 0 | 0 |
| 28.12.2022 09:00 - 10:00 | 30 | 0 | 0 | 0 |
| 28.12.2022 10:00 - 11:00 | 30 | 0 | 0 | 0 |
| 28.12.2022 11:00 - 12:00 | 30 | 0 | 0 | 0 |
| 28.12.2022 12:00 - 13:00 | 30 | 0 | 0 | 0 |
| 28.12.2022 13:00 - 14:00 | 30 | 0 | 0 | 0 |
| 28.12.2022 14:00 - 15:00 | 30 | 0 | 0 | 0 |
| 28.12.2022 15:00 - 16:00 | 30 | 0 | 0 | 0 |
| 28.12.2022 16:00 - 17:00 | 30 | 0 | 0 | 0 |
| 28.12.2022 17:00 - 18:00 | 30 | 0 | 0 | 0 |
| 28.12.2022 18:00 - 19:00 | 30 | 0 | 0 | 0 |
| 28.12.2022 19:00 - 20:00 | 30 | 0 | 0 | 0 |
| 28.12.2022 20:00 - 21:00 | 30 | 0 | 0 | 0 |
| 28.12.2022 21:00 - 22:00 | 30 | 0 | 0 | 0 |
| 28.12.2022 22:00 - 23:00 | 30 | 0 | 0 | 0 |
| 28.12.2022 23:00 - 24:00 | 30 | 0 | 0 | 0 |
| 29.12.2022 00:00 - 01:00 | 30 | 0 | 0 | 0 |
| 29.12.2022 01:00 - 02:00 | 30 | 0 | 0 | 0 |
| 29.12.2022 02:00 - 03:00 | 30 | 0 | 0 | 0 |
| 29.12.2022 03:00 - 04:00 | 30 | 0 | 0 | 0 |
| 29.12.2022 04:00 - 05:00 | 30 | 0 | 0 | 0 |
| 29.12.2022 05:00 - 06:00 | 30 | 0 | 0 | 0 |
| 29.12.2022 06:00 - 07:00 | 0 | 0 | 0 | 0 |
| 29.12.2022 07:00 - 08:00 | 0 | 0 | 0 | 0 |
| 29.12.2022 08:00 - 09:00 | 0 | 0 | 0 | 0 |
| 29.12.2022 09:00 - 10:00 | 0 | 0 | 0 | 0 |
| 29.12.2022 10:00 - 11:00 | 0 | 0 | 0 | 0 |
| 29.12.2022 11:00 - 12:00 | 0 | 0 | 0 | 0 |
| 29.12.2022 12:00 - 13:00 | 0 | 0 | 0 | 0 |
| 29.12.2022 13:00 - 14:00 | 0 | 0 | 0 | 0 |
| 29.12.2022 14:00 - 15:00 | 0 | 0 | 0 | 0 |
| 29.12.2022 15:00 - 16:00 | 0 | 0 | 0 | 0 |
| 29.12.2022 16:00 - 17:00 | 0 | 0 | 0 | 0 |
| 29.12.2022 17:00 - 18:00 | 0 | 0 | 0 | 0 |
| 29.12.2022 18:00 - 19:00 | 0 | 0 | 0 | 0 |
| 29.12.2022 19:00 - 20:00 | 0 | 0 | 0 | 0 |
| 29.12.2022 20:00 - 21:00 | 0 | 0 | 0 | 0 |
| 29.12.2022 21:00 - 22:00 | 0 | 0 | 0 | 0 |
| 29.12.2022 22:00 - 23:00 | 0 | 0 | 0 | 0 |
| 29.12.2022 23:00 - 24:00 | 0 | 0 | 0 | 0 |
| 30.12.2022 00:00 - 01:00 | 0 | 0 | 0 | 0 |
| 30.12.2022 01:00 - 02:00 | 0 | 0 | 0 | 0 |
| 30.12.2022 02:00 - 03:00 | 0 | 0 | 0 | 0 |
| 30.12.2022 03:00 - 04:00 | 0 | 0 | 0 | 0 |
| 30.12.2022 04:00 - 05:00 | 0 | 0 | 0 | 0 |
| 30.12.2022 05:00 - 06:00 | 0 | 0 | 0 | 0 |
| 30.12.2022 06:00 - 07:00 | 0 | 0 | 0 | 0 |
| 30.12.2022 07:00 - 08:00 | 0 | 0 | 0 | 0 |
| 30.12.2022 08:00 - 09:00 | 0 | 0 | 0 | 0 |
| 30.12.2022 09:00 - 10:00 | 0 | 0 | 0 | 0 |
| 30.12.2022 10:00 - 11:00 | 0 | 0 | 0 | 0 |
| 30.12.2022 11:00 - 12:00 | 0 | 0 | 0 | 0 |
| 30.12.2022 12:00 - 13:00 | 0 | 0 | 0 | 0 |
| 30.12.2022 13:00 - 14:00 | 0 | 0 | 0 | 0 |
| 30.12.2022 14:00 - 15:00 | 0 | 0 | 0 | 0 |
| 30.12.2022 15:00 - 16:00 | 0 | 0 | 0 | 0 |
| 30.12.2022 16:00 - 17:00 | 0 | 0 | 0 | 0 |
| 30.12.2022 17:00 - 18:00 | 0 | 0 | 0 | 0 |
| 30.12.2022 18:00 - 19:00 | 0 | 0 | 0 | 0 |
| 30.12.2022 19:00 - 20:00 | 0 | 0 | 0 | 0 |
| 30.12.2022 20:00 - 21:00 | 0 | 0 | 0 | 0 |
| 30.12.2022 21:00 - 22:00 | 0 | -30 | 0 | 0 |
| 30.12.2022 22:00 - 23:00 | 0 | -30 | 0 | 0 |
| 30.12.2022 23:00 - 24:00 | 0 | -80 | 0 | 0 |
| 31.12.2022 00:00 - 01:00 | 0 | -80 | 0 | 0 |
| 31.12.2022 01:00 - 02:00 | 0 | -130 | 0 | 0 |
| 31.12.2022 02:00 - 03:00 | 0 | -200 | 0 | 0 |
| 31.12.2022 03:00 - 04:00 | 0 | -200 | 0 | 0 |
| 31.12.2022 04:00 - 05:00 | 0 | -200 | 0 | 0 |
| 31.12.2022 05:00 - 06:00 | 0 | -200 | 0 | 0 |
| 31.12.2022 06:00 - 07:00 | 0 | 0 | 0 | 0 |
| 31.12.2022 07:00 - 08:00 | 0 | 0 | 0 | 0 |
| 31.12.2022 08:00 - 09:00 | 0 | 0 | 0 | 0 |
| 31.12.2022 09:00 - 10:00 | 0 | 0 | 0 | 0 |
| 31.12.2022 10:00 - 11:00 | 0 | 0 | 0 | 0 |
| 31.12.2022 11:00 - 12:00 | 0 | 0 | 0 | 0 |
| 31.12.2022 12:00 - 13:00 | 0 | 0 | 0 | 0 |
| 31.12.2022 13:00 - 14:00 | 0 | 0 | 0 | 0 |
| 31.12.2022 14:00 - 15:00 | 0 | 0 | 0 | 0 |
| 31.12.2022 15:00 - 16:00 | 0 | 0 | 0 | 0 |
| 31.12.2022 16:00 - 17:00 | 0 | 0 | 0 | 0 |
| 31.12.2022 17:00 - 18:00 | 0 | 0 | 0 | 0 |
| 31.12.2022 18:00 - 19:00 | 0 | 0 | 0 | 0 |
| 31.12.2022 19:00 - 20:00 | 0 | 0 | 0 | 0 |
| 31.12.2022 20:00 - 21:00 | 0 | 0 | 0 | 0 |
| 31.12.2022 21:00 - 22:00 | 0 | 0 | 0 | 0 |
| 31.12.2022 22:00 - 23:00 | 0 | 0 | 0 | 0 |
| 31.12.2022 23:00 - 24:00 | 0 | 0 | 0 | 0 |
| 01.01.2023 00:00 - 01:00 | 0 | 0 | 0 | 0 |
| 01.01.2023 01:00 - 02:00 | 0 | 0 | 0 | 0 |
| 01.01.2023 02:00 - 03:00 | 0 | 0 | 0 | 0 |
| 01.01.2023 03:00 - 04:00 | 0 | 0 | 0 | 0 |
| 01.01.2023 04:00 - 05:00 | 0 | 0 | 0 | 0 |
| 01.01.2023 05:00 - 06:00 | 0 | 0 | 0 | 0 |